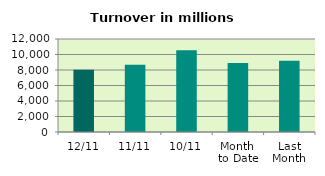
| Category | Series 0 |
|---|---|
| 12/11 | 8047.636 |
| 11/11 | 8670.854 |
| 10/11 | 10538.76 |
| Month 
to Date | 8912.706 |
| Last
Month | 9192.028 |